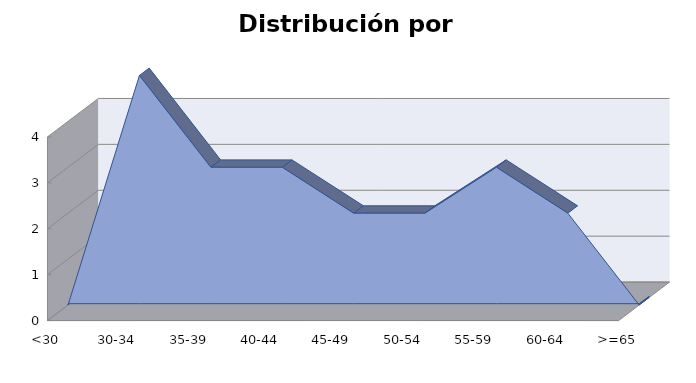
| Category | Series 1 |
|---|---|
| <30 | 0 |
| 30-34 | 5 |
| 35-39 | 3 |
| 40-44 | 3 |
| 45-49 | 2 |
| 50-54 | 2 |
| 55-59 | 3 |
| 60-64 | 2 |
| >=65 | 0 |